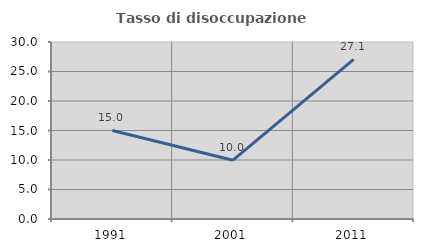
| Category | Tasso di disoccupazione giovanile  |
|---|---|
| 1991.0 | 15.013 |
| 2001.0 | 9.966 |
| 2011.0 | 27.059 |